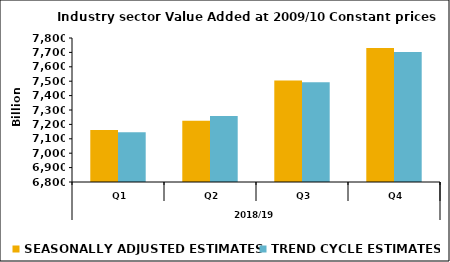
| Category | SEASONALLY ADJUSTED ESTIMATES | TREND CYCLE ESTIMATES |
|---|---|---|
| 0 | 7161.949 | 7144.625 |
| 1 | 7225.705 | 7257.532 |
| 2 | 7504.325 | 7492.784 |
| 3 | 7730.486 | 7703.102 |